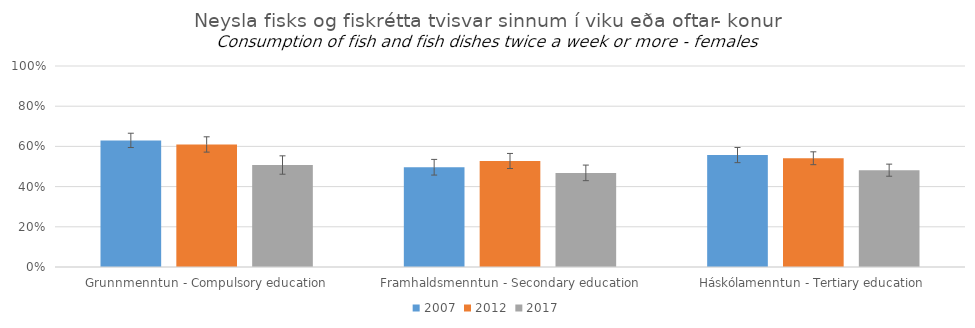
| Category | 2007 | 2012 | 2017 |
|---|---|---|---|
| Grunnmenntun - Compulsory education | 0.63 | 0.61 | 0.507 |
| Framhaldsmenntun - Secondary education | 0.496 | 0.527 | 0.468 |
| Háskólamenntun - Tertiary education | 0.557 | 0.541 | 0.482 |